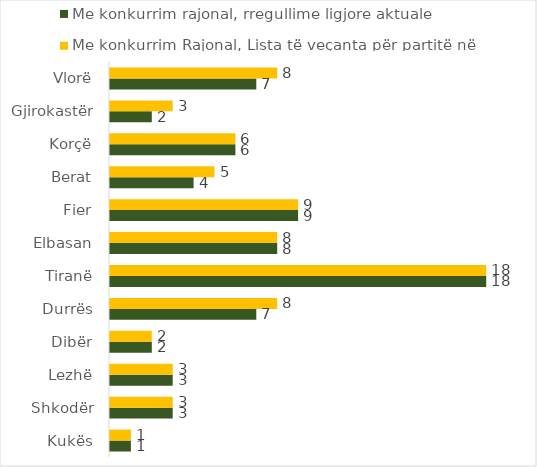
| Category | Me konkurrim rajonal, rregullime ligjore aktuale | Me konkurrim Rajonal, Lista të veçanta për partitë në koalicione |
|---|---|---|
| Kukës | 1 | 1 |
| Shkodër | 3 | 3 |
| Lezhë | 3 | 3 |
| Dibër | 2 | 2 |
| Durrës | 7 | 8 |
| Tiranë | 18 | 18 |
| Elbasan | 8 | 8 |
| Fier | 9 | 9 |
| Berat | 4 | 5 |
| Korçë | 6 | 6 |
| Gjirokastër | 2 | 3 |
| Vlorë | 7 | 8 |